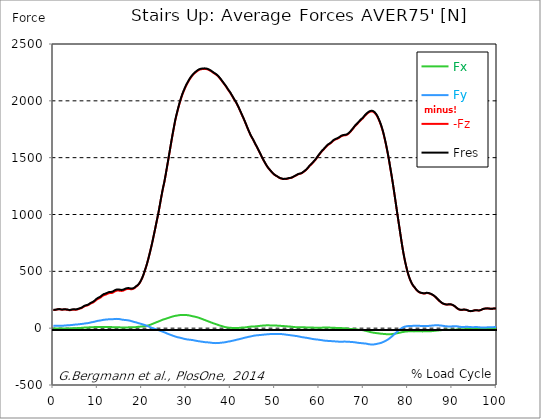
| Category |  Fx |  Fy |  -Fz |  Fres |
|---|---|---|---|---|
| 0.0 | -2.487 | 21.726 | 160.762 | 162.327 |
| 0.16678370786516855 | -2.748 | 21.4 | 160.659 | 162.187 |
| 0.3335674157303371 | -2.823 | 21.195 | 160.389 | 161.898 |
| 0.5003511235955057 | -2.804 | 21.064 | 160.1 | 161.591 |
| 0.6671348314606742 | -2.72 | 21.241 | 162.178 | 163.669 |
| 0.8339185393258427 | -2.767 | 21.083 | 164.06 | 165.532 |
| 1.0007022471910114 | -2.795 | 21.092 | 165.513 | 166.994 |
| 1.1674859550561796 | -2.73 | 21.4 | 166.352 | 167.861 |
| 1.3342696629213484 | -2.692 | 21.642 | 166.398 | 167.935 |
| 1.5010533707865168 | -2.814 | 21.707 | 165.448 | 166.994 |
| 1.6678370786516854 | -3.149 | 21.521 | 164.013 | 165.55 |
| 1.8346207865168538 | -3.522 | 21.213 | 162.504 | 164.023 |
| 2.001404494382023 | -3.577 | 21.204 | 162.327 | 163.855 |
| 2.1681882022471908 | -3.494 | 21.688 | 163.221 | 164.814 |
| 2.334971910112359 | -3.419 | 22.21 | 164.181 | 165.849 |
| 2.501755617977528 | -3.168 | 22.76 | 164.833 | 166.575 |
| 2.668539325842697 | -2.991 | 23.309 | 164.395 | 166.212 |
| 2.8353230337078656 | -2.711 | 23.999 | 163.79 | 165.709 |
| 3.0021067415730336 | -2.404 | 24.763 | 162.821 | 164.814 |
| 3.168890449438202 | -1.947 | 25.778 | 162.141 | 164.274 |
| 3.335674157303371 | -1.901 | 25.992 | 160.557 | 162.756 |
| 3.502457865168539 | -1.994 | 26.039 | 158.591 | 160.808 |
| 3.6692415730337076 | -2.012 | 26.235 | 157.315 | 159.579 |
| 3.8360252808988764 | -1.761 | 26.728 | 158.358 | 160.697 |
| 4.002808988764046 | -1.509 | 27.259 | 160.1 | 162.504 |
| 4.169592696629214 | -1.239 | 27.856 | 161.684 | 164.162 |
| 4.3363764044943816 | -0.941 | 28.657 | 162.849 | 165.439 |
| 4.50316011235955 | -0.643 | 29.467 | 163.408 | 166.128 |
| 4.669943820224718 | -0.419 | 30.529 | 163.035 | 165.96 |
| 4.836727528089888 | -0.205 | 31.219 | 162.374 | 165.457 |
| 5.003511235955056 | 0.009 | 31.703 | 161.88 | 165.075 |
| 5.170294943820225 | 0.224 | 32.244 | 162.448 | 165.727 |
| 5.337078651685394 | 0.438 | 32.477 | 163.473 | 166.78 |
| 5.5038623595505625 | 0.661 | 32.859 | 165.224 | 168.569 |
| 5.670646067415731 | 1.099 | 33.753 | 167.74 | 171.215 |
| 5.837429775280899 | 1.621 | 34.722 | 170.451 | 174.056 |
| 6.004213483146067 | 1.984 | 35.43 | 172.118 | 175.826 |
| 6.170997191011236 | 2.31 | 36.119 | 173.59 | 177.391 |
| 6.329002808988764 | 2.655 | 36.781 | 175.938 | 179.823 |
| 6.495786516853932 | 3.27 | 37.479 | 179.944 | 183.894 |
| 6.662570224719101 | 3.922 | 38.43 | 184.276 | 188.329 |
| 6.82935393258427 | 4.574 | 39.38 | 188.487 | 192.67 |
| 6.9961376404494375 | 5.198 | 40.544 | 192.288 | 196.639 |
| 7.162921348314607 | 5.655 | 41.672 | 195.064 | 199.601 |
| 7.329705056179775 | 5.897 | 42.557 | 196.788 | 201.483 |
| 7.496488764044945 | 6.046 | 43.162 | 198.064 | 202.853 |
| 7.663272471910113 | 6.195 | 43.787 | 199.518 | 204.418 |
| 7.830056179775281 | 6.521 | 44.774 | 202.229 | 207.287 |
| 7.996839887640449 | 6.931 | 46.041 | 205.881 | 211.154 |
| 8.16362359550562 | 7.323 | 47.504 | 210.25 | 215.747 |
| 8.330407303370787 | 8.003 | 49.33 | 215.16 | 220.945 |
| 8.497191011235955 | 8.422 | 50.867 | 218.709 | 224.755 |
| 8.663974719101123 | 8.534 | 52.05 | 221.243 | 227.504 |
| 8.830758426966291 | 8.618 | 53.149 | 223.628 | 230.075 |
| 8.99754213483146 | 8.841 | 54.351 | 226.721 | 233.373 |
| 9.16432584269663 | 9.251 | 55.637 | 230.941 | 237.789 |
| 9.331109550561798 | 9.782 | 57.426 | 236.494 | 243.621 |
| 9.497893258426966 | 10.332 | 59.41 | 242.512 | 249.947 |
| 9.664676966292134 | 10.77 | 61.217 | 248.167 | 255.881 |
| 9.831460674157304 | 11.012 | 62.801 | 252.9 | 260.865 |
| 9.998244382022472 | 11.217 | 64.208 | 256.785 | 264.974 |
| 10.16502808988764 | 11.226 | 65.139 | 259.673 | 268.002 |
| 10.331811797752808 | 11.077 | 65.978 | 262.607 | 271.048 |
| 10.498595505617978 | 10.975 | 66.91 | 265.924 | 274.495 |
| 10.665379213483147 | 10.853 | 68.139 | 270.321 | 279.051 |
| 10.832162921348315 | 10.872 | 69.509 | 275.455 | 284.352 |
| 10.998946629213483 | 10.993 | 70.906 | 280.988 | 290.072 |
| 11.165730337078653 | 11.142 | 72.276 | 286.112 | 295.373 |
| 11.33251404494382 | 11.263 | 73.422 | 289.625 | 299.062 |
| 11.49929775280899 | 11.226 | 74.391 | 292.28 | 301.876 |
| 11.666081460674157 | 10.844 | 74.931 | 293.444 | 303.115 |
| 11.832865168539326 | 10.462 | 75.35 | 294.982 | 304.698 |
| 11.999648876404493 | 10.276 | 75.89 | 298.363 | 308.099 |
| 12.166432584269662 | 10.229 | 76.487 | 301.661 | 311.443 |
| 12.333216292134832 | 10.36 | 77.353 | 304.549 | 314.453 |
| 12.5 | 10.509 | 78.201 | 307.214 | 317.238 |
| 12.66678370786517 | 10.593 | 78.816 | 308.509 | 318.645 |
| 12.833567415730336 | 10.378 | 79.049 | 308.984 | 319.148 |
| 13.000351123595506 | 9.847 | 78.825 | 308.686 | 318.785 |
| 13.167134831460674 | 9.232 | 78.518 | 308.593 | 318.589 |
| 13.333918539325843 | 8.832 | 78.788 | 310.838 | 320.816 |
| 13.500702247191011 | 8.45 | 79.244 | 314.154 | 324.132 |
| 13.667485955056181 | 8.142 | 79.869 | 318.794 | 328.772 |
| 13.834269662921349 | 8.003 | 80.642 | 323.014 | 333.048 |
| 14.001053370786519 | 7.816 | 81.136 | 326.275 | 336.327 |
| 14.167837078651687 | 7.695 | 81.499 | 328.856 | 338.908 |
| 14.334620786516853 | 7.751 | 81.75 | 330.56 | 340.622 |
| 14.501404494382026 | 7.854 | 81.648 | 331.352 | 341.367 |
| 14.668188202247192 | 7.77 | 81.163 | 331.213 | 341.116 |
| 14.834971910112362 | 7.528 | 80.334 | 330.467 | 340.193 |
| 15.001755617977528 | 7.201 | 79.235 | 329.061 | 338.563 |
| 15.168539325842698 | 6.829 | 77.866 | 327.924 | 337.147 |
| 15.335323033707864 | 6.41 | 76.468 | 327.682 | 336.597 |
| 15.502106741573034 | 6.009 | 75.192 | 328.008 | 336.635 |
| 15.6688904494382 | 5.664 | 74.074 | 328.911 | 337.268 |
| 15.83567415730337 | 5.646 | 73.235 | 331.79 | 339.914 |
| 16.00245786516854 | 5.59 | 72.574 | 335.097 | 343.026 |
| 16.16924157303371 | 5.636 | 71.912 | 338.321 | 346.053 |
| 16.336025280898877 | 5.907 | 71.437 | 341.293 | 348.876 |
| 16.502808988764045 | 6.242 | 70.739 | 343.603 | 351.019 |
| 16.669592696629216 | 6.54 | 69.975 | 344.935 | 352.193 |
| 16.83637640449438 | 6.987 | 69.136 | 345.616 | 352.705 |
| 17.003160112359552 | 7.267 | 68.028 | 345.644 | 352.528 |
| 17.169943820224717 | 7.416 | 66.649 | 344.945 | 351.587 |
| 17.336727528089888 | 7.201 | 65.009 | 343.473 | 349.808 |
| 17.503511235955056 | 6.959 | 63.146 | 342.373 | 348.355 |
| 17.670294943820224 | 7.052 | 61.245 | 342.541 | 348.168 |
| 17.837078651685395 | 7.211 | 59.28 | 343.538 | 348.802 |
| 18.003862359550563 | 7.444 | 57.323 | 345.951 | 350.87 |
| 18.17064606741573 | 7.714 | 55.441 | 349.361 | 353.944 |
| 18.3374297752809 | 7.984 | 53.662 | 353.702 | 357.96 |
| 18.504213483146067 | 8.534 | 52.031 | 359.143 | 363.121 |
| 18.662219101123597 | 9.465 | 50.764 | 365.142 | 368.86 |
| 18.829002808988765 | 10.434 | 48.64 | 369.745 | 373.155 |
| 18.995786516853933 | 11.357 | 46.47 | 374.776 | 377.915 |
| 19.1625702247191 | 12.139 | 44.569 | 381.306 | 384.204 |
| 19.32935393258427 | 12.633 | 42.743 | 389.607 | 392.272 |
| 19.49613764044944 | 13.071 | 40.833 | 398.951 | 401.364 |
| 19.662921348314608 | 13.76 | 39.026 | 410.261 | 412.46 |
| 19.829705056179776 | 14.468 | 37.144 | 423.257 | 425.26 |
| 19.996488764044944 | 15.232 | 35.327 | 437.269 | 439.104 |
| 20.163272471910112 | 15.922 | 33.492 | 452.883 | 454.542 |
| 20.33005617977528 | 16.527 | 31.377 | 470.407 | 471.898 |
| 20.49683988764045 | 17.291 | 29.235 | 489.384 | 490.707 |
| 20.663623595505616 | 18.232 | 27.045 | 509.275 | 510.486 |
| 20.830407303370787 | 19.229 | 24.753 | 529.286 | 530.395 |
| 20.997191011235955 | 20.375 | 22.322 | 549.773 | 550.779 |
| 21.163974719101123 | 21.949 | 19.816 | 572.663 | 573.613 |
| 21.330758426966295 | 23.598 | 17.235 | 596.354 | 597.248 |
| 21.497542134831463 | 25.406 | 14.552 | 621.163 | 622.011 |
| 21.66432584269663 | 27.53 | 11.822 | 647.603 | 648.46 |
| 21.8311095505618 | 29.849 | 9.046 | 674.108 | 674.993 |
| 21.997893258426966 | 32.188 | 6.27 | 700.762 | 701.693 |
| 22.164676966292134 | 34.563 | 3.54 | 728.31 | 729.288 |
| 22.331460674157306 | 37.153 | 0.932 | 757.405 | 758.467 |
| 22.498244382022467 | 39.855 | -1.407 | 787.953 | 789.099 |
| 22.66502808988764 | 42.492 | -3.605 | 818.976 | 820.234 |
| 22.831811797752806 | 45.156 | -5.627 | 849.273 | 850.633 |
| 22.99859550561798 | 47.923 | -7.779 | 880.696 | 882.178 |
| 23.165379213483146 | 50.653 | -10.062 | 912.689 | 914.272 |
| 23.332162921348313 | 53.233 | -12.158 | 944.019 | 945.724 |
| 23.49894662921348 | 55.6 | -14.459 | 975.573 | 977.381 |
| 23.665730337078653 | 57.947 | -16.816 | 1006.494 | 1008.413 |
| 23.83251404494382 | 60.621 | -19.042 | 1041.449 | 1043.499 |
| 23.999297752808985 | 63.192 | -21.213 | 1077.484 | 1079.646 |
| 24.166081460674157 | 66.229 | -23.71 | 1114.256 | 1116.575 |
| 24.332865168539325 | 69.015 | -26.114 | 1149.583 | 1152.043 |
| 24.499648876404496 | 71.801 | -28.573 | 1184.501 | 1187.1 |
| 24.666432584269664 | 74.53 | -30.995 | 1218.71 | 1221.468 |
| 24.833216292134832 | 76.626 | -33.296 | 1249.109 | 1251.978 |
| 25.0 | 78.499 | -35.56 | 1277.794 | 1280.784 |
| 25.16678370786517 | 80.605 | -38.392 | 1312.05 | 1315.171 |
| 25.33356741573034 | 82.71 | -41.308 | 1347.806 | 1351.057 |
| 25.500351123595504 | 84.937 | -44.318 | 1385.192 | 1388.583 |
| 25.66713483146067 | 87.079 | -47.103 | 1422.466 | 1425.988 |
| 25.833918539325843 | 89.166 | -49.674 | 1459.955 | 1463.598 |
| 26.00070224719101 | 91.262 | -52.199 | 1497.817 | 1501.59 |
| 26.16748595505618 | 93.405 | -54.733 | 1535.92 | 1539.814 |
| 26.334269662921347 | 95.576 | -57.193 | 1574.08 | 1578.104 |
| 26.50105337078652 | 97.812 | -59.727 | 1613.264 | 1617.41 |
| 26.667837078651687 | 99.954 | -62.028 | 1651.274 | 1655.541 |
| 26.834620786516858 | 101.957 | -64.338 | 1688.344 | 1692.723 |
| 27.001404494382022 | 103.811 | -66.723 | 1723.82 | 1728.301 |
| 27.16818820224719 | 105.591 | -69.09 | 1758.868 | 1763.461 |
| 27.334971910112362 | 107.091 | -71.419 | 1793.786 | 1798.462 |
| 27.50175561797753 | 108.32 | -73.617 | 1827.026 | 1831.777 |
| 27.668539325842698 | 109.466 | -75.76 | 1855.543 | 1860.378 |
| 27.835323033707866 | 110.379 | -77.819 | 1882.821 | 1887.722 |
| 28.002106741573037 | 111.563 | -79.514 | 1908.954 | 1913.919 |
| 28.168890449438205 | 112.671 | -80.726 | 1933.828 | 1938.849 |
| 28.335674157303373 | 113.789 | -81.927 | 1958.218 | 1963.286 |
| 28.502457865168537 | 114.926 | -83.381 | 1981.76 | 1986.903 |
| 28.669241573033705 | 115.755 | -84.974 | 2003.737 | 2008.936 |
| 28.836025280898877 | 116.146 | -86.604 | 2023.963 | 2029.199 |
| 29.002808988764052 | 116.388 | -88.235 | 2043.415 | 2048.698 |
| 29.169592696629213 | 116.714 | -90.07 | 2061.713 | 2067.042 |
| 29.336376404494384 | 116.817 | -91.84 | 2078.23 | 2083.597 |
| 29.50316011235955 | 116.556 | -93.358 | 2093.304 | 2098.689 |
| 29.669943820224724 | 116.398 | -95.091 | 2109.03 | 2114.443 |
| 29.836727528089884 | 116.221 | -96.722 | 2123.917 | 2129.358 |
| 30.003511235955056 | 115.68 | -97.886 | 2137.342 | 2142.783 |
| 30.170294943820224 | 114.73 | -98.864 | 2149.491 | 2154.894 |
| 30.337078651685395 | 113.873 | -99.861 | 2161.425 | 2166.81 |
| 30.503862359550563 | 113.118 | -100.532 | 2172.986 | 2178.334 |
| 30.670646067415728 | 111.879 | -101.203 | 2184.203 | 2189.504 |
| 30.837429775280903 | 110.323 | -101.836 | 2194.377 | 2199.603 |
| 30.99543539325843 | 108.786 | -102.591 | 2203.879 | 2209.04 |
| 31.162219101123597 | 107.268 | -103.392 | 2212.86 | 2217.975 |
| 31.32900280898876 | 105.74 | -104.203 | 2221.422 | 2226.48 |
| 31.495786516853936 | 104.324 | -105.218 | 2229.331 | 2234.362 |
| 31.6625702247191 | 102.982 | -106.467 | 2236.309 | 2241.321 |
| 31.82935393258427 | 101.743 | -107.938 | 2242.337 | 2247.358 |
| 31.996137640449433 | 100.467 | -109.373 | 2247.889 | 2252.929 |
| 32.162921348314605 | 98.846 | -110.789 | 2253.013 | 2258.044 |
| 32.329705056179776 | 97.094 | -111.991 | 2258.025 | 2263.038 |
| 32.49648876404494 | 95.324 | -113.156 | 2263.047 | 2268.031 |
| 32.66327247191011 | 93.284 | -114.199 | 2267.826 | 2272.764 |
| 32.83005617977528 | 90.824 | -115.01 | 2271.487 | 2276.369 |
| 32.996839887640455 | 88.672 | -116.053 | 2274.45 | 2279.294 |
| 33.16362359550562 | 86.567 | -117.273 | 2276.453 | 2281.279 |
| 33.330407303370784 | 84.201 | -118.047 | 2277.869 | 2282.648 |
| 33.497191011235955 | 81.722 | -118.624 | 2279.09 | 2283.804 |
| 33.66397471910113 | 79.17 | -119.789 | 2279.853 | 2284.549 |
| 33.83075842696629 | 76.599 | -120.963 | 2280.515 | 2285.21 |
| 33.997542134831455 | 74.055 | -121.987 | 2280.934 | 2285.592 |
| 34.164325842696634 | 71.549 | -123.059 | 2281.12 | 2285.76 |
| 34.3311095505618 | 69.08 | -123.683 | 2280.925 | 2285.518 |
| 34.49789325842697 | 66.593 | -124.028 | 2279.863 | 2284.409 |
| 34.66467696629213 | 64.217 | -124.745 | 2277.962 | 2282.481 |
| 34.831460674157306 | 61.711 | -125.006 | 2275.913 | 2280.357 |
| 34.99824438202247 | 59.028 | -125.146 | 2273.285 | 2277.673 |
| 35.16502808988764 | 56.69 | -125.742 | 2270.267 | 2274.636 |
| 35.331811797752806 | 54.184 | -126.701 | 2266.764 | 2271.133 |
| 35.49859550561798 | 51.882 | -127.605 | 2262.73 | 2267.099 |
| 35.66537921348315 | 49.078 | -128.472 | 2258.473 | 2262.842 |
| 35.83216292134831 | 46.386 | -129.217 | 2253.973 | 2258.333 |
| 35.998946629213485 | 44.103 | -130.232 | 2248.774 | 2253.181 |
| 36.16573033707865 | 41.923 | -130.838 | 2243.958 | 2248.364 |
| 36.33251404494382 | 39.706 | -131.211 | 2240.138 | 2244.535 |
| 36.499297752808985 | 37.554 | -131.481 | 2236.477 | 2240.856 |
| 36.666081460674164 | 35.495 | -131.639 | 2232.294 | 2236.654 |
| 36.83286516853932 | 33.343 | -131.388 | 2227.012 | 2231.344 |
| 36.99964887640449 | 30.734 | -130.81 | 2221.357 | 2225.623 |
| 37.166432584269664 | 28.564 | -130.409 | 2215.301 | 2219.531 |
| 37.333216292134836 | 26.356 | -129.888 | 2208.267 | 2212.45 |
| 37.5 | 24.204 | -129.562 | 2200.544 | 2204.699 |
| 37.666783707865164 | 21.884 | -129.068 | 2192.597 | 2196.706 |
| 37.833567415730336 | 19.928 | -128.173 | 2184.185 | 2188.237 |
| 38.00035112359551 | 18.176 | -127.382 | 2175.511 | 2179.517 |
| 38.16713483146068 | 16.359 | -126.711 | 2166.437 | 2170.396 |
| 38.333918539325836 | 14.44 | -126.096 | 2157.652 | 2161.574 |
| 38.50070224719101 | 12.297 | -125.528 | 2148.932 | 2152.817 |
| 38.66748595505618 | 10.397 | -124.494 | 2140.407 | 2144.246 |
| 38.83426966292135 | 8.571 | -123.189 | 2132.265 | 2136.038 |
| 39.001053370786515 | 7.36 | -121.736 | 2122.613 | 2126.312 |
| 39.16783707865169 | 6.158 | -120.031 | 2112.626 | 2116.241 |
| 39.33462078651686 | 5.674 | -118.773 | 2101.968 | 2105.527 |
| 39.50140449438202 | 4.817 | -117.814 | 2092.568 | 2096.09 |
| 39.668188202247194 | 3.987 | -117.05 | 2083.979 | 2087.472 |
| 39.83497191011236 | 3.326 | -116.044 | 2074.727 | 2078.184 |
| 40.00175561797753 | 2.953 | -114.628 | 2064.358 | 2067.759 |
| 40.168539325842694 | 2.692 | -113.323 | 2053.347 | 2056.691 |
| 40.335323033707866 | 2.227 | -111.451 | 2042.54 | 2045.81 |
| 40.50210674157304 | 1.714 | -109.839 | 2031.276 | 2034.472 |
| 40.6688904494382 | 1.258 | -108.47 | 2020.153 | 2023.292 |
| 40.83567415730337 | 0.997 | -107.128 | 2008.955 | 2012.029 |
| 41.00245786516854 | 0.885 | -105.554 | 1998.53 | 2001.539 |
| 41.16924157303371 | 0.904 | -103.849 | 1988.729 | 1991.663 |
| 41.33602528089887 | 1.053 | -101.967 | 1976.664 | 1979.506 |
| 41.502808988764045 | 1.314 | -100.355 | 1963.677 | 1966.454 |
| 41.669592696629216 | 1.519 | -99.041 | 1950.551 | 1953.28 |
| 41.83637640449439 | 1.919 | -97.653 | 1937.284 | 1939.958 |
| 42.00316011235955 | 2.814 | -96.125 | 1923.021 | 1925.648 |
| 42.16994382022472 | 3.792 | -94.57 | 1908.627 | 1911.189 |
| 42.33672752808989 | 4.64 | -92.911 | 1894.001 | 1896.498 |
| 42.50351123595506 | 5.152 | -91.151 | 1879.44 | 1881.862 |
| 42.670294943820224 | 5.441 | -89.306 | 1865.027 | 1867.375 |
| 42.83707865168539 | 5.674 | -87.536 | 1850.736 | 1853.019 |
| 43.00386235955057 | 5.981 | -85.952 | 1835.746 | 1837.973 |
| 43.17064606741573 | 6.316 | -84.303 | 1820.505 | 1822.666 |
| 43.32865168539326 | 6.95 | -82.738 | 1804.984 | 1807.089 |
| 43.495435393258425 | 7.807 | -81.219 | 1789.239 | 1791.298 |
| 43.6622191011236 | 8.981 | -79.729 | 1772.666 | 1774.669 |
| 43.82900280898876 | 10.183 | -78.257 | 1756.837 | 1758.803 |
| 43.99578651685393 | 11.152 | -76.729 | 1741.484 | 1743.394 |
| 44.162570224719104 | 11.925 | -75.201 | 1726.364 | 1728.236 |
| 44.32935393258427 | 12.801 | -73.86 | 1711.532 | 1713.367 |
| 44.49613764044944 | 13.891 | -72.574 | 1697.586 | 1699.393 |
| 44.66292134831461 | 14.636 | -71.335 | 1685.055 | 1686.835 |
| 44.82970505617978 | 14.897 | -69.909 | 1673.894 | 1675.636 |
| 44.99648876404493 | 14.906 | -68.307 | 1662.296 | 1663.982 |
| 45.16327247191011 | 15.102 | -66.863 | 1649.374 | 1651.014 |
| 45.33005617977528 | 15.269 | -65.661 | 1636.499 | 1638.101 |
| 45.49683988764045 | 15.465 | -64.608 | 1623.912 | 1625.487 |
| 45.66362359550561 | 15.968 | -63.77 | 1611.755 | 1613.32 |
| 45.83040730337079 | 16.788 | -63.155 | 1599.867 | 1601.432 |
| 45.99719101123596 | 17.626 | -62.596 | 1587.29 | 1588.855 |
| 46.16397471910113 | 18.446 | -62.074 | 1574.21 | 1575.785 |
| 46.33075842696629 | 19.08 | -61.366 | 1561.139 | 1562.704 |
| 46.497542134831455 | 19.732 | -60.789 | 1548.152 | 1549.699 |
| 46.66432584269663 | 20.421 | -60.127 | 1534.988 | 1536.535 |
| 46.83110955056179 | 21.139 | -59.54 | 1521.862 | 1523.399 |
| 46.99789325842696 | 21.903 | -58.823 | 1508.167 | 1509.695 |
| 47.164676966292134 | 22.424 | -58.078 | 1495.18 | 1496.689 |
| 47.331460674157306 | 22.871 | -57.239 | 1482.864 | 1484.354 |
| 47.49824438202247 | 23.309 | -56.773 | 1471.004 | 1472.476 |
| 47.66502808988764 | 23.85 | -56.364 | 1459.48 | 1460.952 |
| 47.83181179775281 | 24.306 | -55.683 | 1448.086 | 1449.549 |
| 47.99859550561797 | 24.688 | -54.929 | 1436.692 | 1438.136 |
| 48.16537921348314 | 24.93 | -54.305 | 1426.184 | 1427.609 |
| 48.33216292134831 | 24.93 | -53.69 | 1416.672 | 1418.078 |
| 48.498946629213485 | 24.772 | -53.103 | 1407.84 | 1409.228 |
| 48.66573033707865 | 24.604 | -52.702 | 1400.023 | 1401.393 |
| 48.83251404494382 | 24.511 | -52.339 | 1392.356 | 1393.716 |
| 48.99929775280899 | 24.353 | -51.808 | 1384.419 | 1385.76 |
| 49.166081460674164 | 24.269 | -51.594 | 1377.208 | 1378.54 |
| 49.33286516853933 | 24.418 | -51.491 | 1369.885 | 1371.218 |
| 49.499648876404486 | 24.446 | -51.445 | 1363.047 | 1364.389 |
| 49.666432584269664 | 24.39 | -51.379 | 1357.029 | 1358.37 |
| 49.83321629213483 | 24.334 | -51.258 | 1351.169 | 1352.501 |
| 50.0 | 24.045 | -51.091 | 1345.933 | 1347.265 |
| 50.166783707865164 | 23.347 | -50.839 | 1342.095 | 1343.39 |
| 50.33356741573034 | 22.639 | -50.699 | 1338.508 | 1339.775 |
| 50.50035112359551 | 22.257 | -50.886 | 1334.744 | 1336.002 |
| 50.66713483146068 | 22.08 | -51.109 | 1330.133 | 1331.409 |
| 50.83391853932584 | 21.837 | -51.398 | 1326.089 | 1327.375 |
| 51.00070224719101 | 21.502 | -51.435 | 1321.869 | 1323.155 |
| 51.16748595505618 | 20.729 | -51.435 | 1319.223 | 1320.5 |
| 51.33426966292134 | 20.086 | -51.761 | 1317.584 | 1318.86 |
| 51.50105337078652 | 19.62 | -52.134 | 1315.609 | 1316.894 |
| 51.66783707865169 | 19.331 | -52.721 | 1313.578 | 1314.891 |
| 51.83462078651686 | 18.996 | -53.336 | 1311.78 | 1313.112 |
| 52.00140449438202 | 18.353 | -54.118 | 1311.733 | 1313.093 |
| 52.168188202247194 | 17.664 | -55.05 | 1312.301 | 1313.689 |
| 52.33497191011236 | 17.366 | -56.131 | 1312.599 | 1314.043 |
| 52.50175561797752 | 17.095 | -57.221 | 1312.888 | 1314.379 |
| 52.668539325842694 | 16.35 | -58.096 | 1313.745 | 1315.264 |
| 52.835323033707866 | 15.213 | -58.748 | 1315.208 | 1316.745 |
| 53.00210674157304 | 14.682 | -59.54 | 1317.192 | 1318.757 |
| 53.1688904494382 | 14.235 | -60.351 | 1319.195 | 1320.788 |
| 53.33567415730337 | 14.096 | -61.199 | 1320.434 | 1322.074 |
| 53.502457865168545 | 13.742 | -62.168 | 1320.807 | 1322.493 |
| 53.669241573033716 | 13.145 | -63.127 | 1321.692 | 1323.416 |
| 53.83602528089887 | 11.934 | -63.826 | 1324.58 | 1326.332 |
| 54.002808988764045 | 11.114 | -64.636 | 1328.092 | 1329.881 |
| 54.169592696629216 | 10.499 | -65.559 | 1331.633 | 1333.468 |
| 54.33637640449438 | 10.164 | -66.63 | 1335.294 | 1337.185 |
| 54.50316011235955 | 9.493 | -67.636 | 1338.433 | 1340.371 |
| 54.669943820224724 | 8.683 | -68.521 | 1341.275 | 1343.25 |
| 54.836727528089895 | 8.114 | -69.313 | 1344.657 | 1346.669 |
| 55.00351123595506 | 7.649 | -70.114 | 1348.83 | 1350.871 |
| 55.17029494382022 | 8.012 | -71.325 | 1353.041 | 1355.147 |
| 55.337078651685395 | 8.319 | -72.658 | 1355.603 | 1357.783 |
| 55.50386235955056 | 8.562 | -74.074 | 1356.898 | 1359.153 |
| 55.66186797752809 | 8.552 | -75.583 | 1358.268 | 1360.606 |
| 55.82865168539326 | 8.506 | -77.26 | 1359.777 | 1362.209 |
| 55.995435393258425 | 8.31 | -78.611 | 1362.404 | 1364.901 |
| 56.1622191011236 | 7.993 | -79.589 | 1366.606 | 1369.149 |
| 56.32900280898877 | 7.677 | -80.306 | 1371.283 | 1373.854 |
| 56.49578651685393 | 7.593 | -81.182 | 1376.155 | 1378.773 |
| 56.6625702247191 | 7.677 | -82.309 | 1380.962 | 1383.636 |
| 56.82935393258427 | 7.285 | -83.427 | 1385.956 | 1388.686 |
| 56.99613764044943 | 6.568 | -84.424 | 1391.359 | 1394.136 |
| 57.16292134831461 | 5.907 | -85.225 | 1397.694 | 1400.508 |
| 57.329705056179776 | 5.487 | -86.222 | 1404.551 | 1407.421 |
| 57.49648876404495 | 5.348 | -87.405 | 1412.554 | 1415.488 |
| 57.66327247191011 | 5.422 | -88.803 | 1420.808 | 1423.827 |
| 57.83005617977529 | 5.198 | -90.07 | 1428.131 | 1431.214 |
| 57.99683988764044 | 5.31 | -91.197 | 1434.419 | 1437.559 |
| 58.16362359550561 | 5.478 | -92.557 | 1440.391 | 1443.596 |
| 58.33040730337079 | 5.655 | -93.917 | 1446.353 | 1449.642 |
| 58.497191011235955 | 5.292 | -95.119 | 1453.676 | 1457.03 |
| 58.66397471910112 | 4.91 | -96.163 | 1460.458 | 1463.868 |
| 58.83075842696629 | 4.621 | -97.066 | 1468.209 | 1471.666 |
| 58.99754213483147 | 4.267 | -97.989 | 1475.523 | 1479.026 |
| 59.164325842696634 | 3.913 | -98.864 | 1483.115 | 1486.656 |
| 59.33110955056179 | 3.801 | -99.377 | 1492.162 | 1495.711 |
| 59.49789325842697 | 3.689 | -100.113 | 1500.993 | 1504.561 |
| 59.664676966292134 | 3.708 | -100.672 | 1510.664 | 1514.241 |
| 59.8314606741573 | 3.605 | -101.538 | 1519.253 | 1522.849 |
| 59.99824438202247 | 3.661 | -102.61 | 1527.675 | 1531.318 |
| 60.16502808988765 | 3.801 | -103.616 | 1536.041 | 1539.721 |
| 60.33181179775281 | 4.062 | -104.408 | 1544.435 | 1548.143 |
| 60.49859550561798 | 4.36 | -105.274 | 1552.652 | 1556.388 |
| 60.66537921348315 | 4.695 | -106.234 | 1560.347 | 1564.121 |
| 60.83216292134831 | 5.226 | -107.557 | 1566.673 | 1570.502 |
| 60.99894662921348 | 5.413 | -108.814 | 1573.008 | 1576.902 |
| 61.16573033707864 | 5.534 | -109.643 | 1579.856 | 1583.769 |
| 61.33251404494383 | 5.655 | -110.193 | 1587.02 | 1590.951 |
| 61.49929775280899 | 5.702 | -110.65 | 1594.37 | 1598.311 |
| 61.66608146067416 | 5.748 | -111.087 | 1601.647 | 1605.597 |
| 61.83286516853932 | 5.73 | -111.6 | 1608.326 | 1612.295 |
| 61.99964887640451 | 5.627 | -112.271 | 1613.106 | 1617.102 |
| 62.16643258426967 | 5.459 | -112.979 | 1617.018 | 1621.043 |
| 62.33321629213482 | 5.059 | -113.351 | 1621.295 | 1625.329 |
| 62.5 | 4.695 | -113.621 | 1625.869 | 1629.903 |
| 62.66678370786517 | 4.351 | -113.854 | 1630.769 | 1634.812 |
| 62.833567415730336 | 3.95 | -114.171 | 1636.75 | 1640.794 |
| 63.0003511235955 | 3.466 | -114.562 | 1643.71 | 1647.762 |
| 63.16713483146068 | 3.102 | -115.131 | 1650.464 | 1654.544 |
| 63.33391853932585 | 2.851 | -115.783 | 1654.377 | 1658.485 |
| 63.500702247191015 | 2.599 | -116.277 | 1658.224 | 1662.351 |
| 63.66748595505618 | 2.534 | -116.537 | 1660.628 | 1664.774 |
| 63.83426966292135 | 2.497 | -116.854 | 1663.19 | 1667.354 |
| 64.00105337078651 | 2.282 | -117.348 | 1665.556 | 1669.739 |
| 64.16783707865169 | 1.938 | -117.963 | 1668.128 | 1672.348 |
| 64.33462078651687 | 1.574 | -118.559 | 1671.686 | 1675.935 |
| 64.50140449438203 | 1.314 | -118.997 | 1676.084 | 1680.36 |
| 64.6681882022472 | 1.062 | -119.276 | 1680.854 | 1685.13 |
| 64.83497191011236 | 0.866 | -119.453 | 1685.521 | 1689.807 |
| 65.00175561797754 | 0.634 | -119.528 | 1689.499 | 1693.775 |
| 65.16853932584269 | -0.168 | -119.193 | 1692.052 | 1696.3 |
| 65.33532303370787 | -0.932 | -118.699 | 1694.017 | 1698.228 |
| 65.50210674157304 | -1.565 | -118.14 | 1695.816 | 1699.98 |
| 65.66889044943821 | -1.127 | -118.047 | 1696.43 | 1700.576 |
| 65.83567415730337 | -0.503 | -118.252 | 1696.663 | 1700.828 |
| 66.00245786516854 | -1.36 | -118.55 | 1698.005 | 1702.188 |
| 66.1692415730337 | -2.422 | -118.801 | 1700.045 | 1704.247 |
| 66.33602528089888 | -3.82 | -118.978 | 1703.669 | 1707.88 |
| 66.50280898876404 | -4.975 | -119.379 | 1708.56 | 1712.79 |
| 66.66959269662921 | -6.167 | -120.124 | 1713.47 | 1717.746 |
| 66.83637640449439 | -6.531 | -120.338 | 1719.879 | 1724.146 |
| 67.00316011235955 | -6.708 | -120.786 | 1726.969 | 1731.264 |
| 67.16994382022472 | -6.941 | -120.925 | 1734.534 | 1738.81 |
| 67.33672752808988 | -7.229 | -120.981 | 1742.211 | 1746.477 |
| 67.50351123595506 | -7.863 | -121.708 | 1750.12 | 1754.424 |
| 67.67029494382022 | -8.757 | -122.872 | 1757.927 | 1762.297 |
| 67.83707865168539 | -9.493 | -123.329 | 1767.057 | 1771.454 |
| 67.99508426966291 | -9.717 | -124.102 | 1775.237 | 1779.671 |
| 68.16186797752809 | -9.968 | -125.108 | 1782.466 | 1786.957 |
| 68.32865168539327 | -10.676 | -126.413 | 1788.252 | 1792.817 |
| 68.49543539325843 | -11.422 | -127.577 | 1794.428 | 1799.068 |
| 68.6622191011236 | -12.381 | -128.22 | 1802.096 | 1806.772 |
| 68.82900280898876 | -13.807 | -129.254 | 1808.953 | 1813.704 |
| 68.99578651685394 | -14.412 | -130.074 | 1815.791 | 1820.589 |
| 69.1625702247191 | -14.692 | -130.493 | 1822.759 | 1827.585 |
| 69.32935393258425 | -15.54 | -131.024 | 1829.262 | 1834.116 |
| 69.49613764044945 | -16.061 | -131.853 | 1835.597 | 1840.507 |
| 69.66292134831461 | -16.518 | -132.589 | 1840.805 | 1845.761 |
| 69.82970505617978 | -17.179 | -133.335 | 1846.711 | 1851.705 |
| 69.99648876404494 | -18.996 | -133.875 | 1854.835 | 1859.857 |
| 70.16327247191012 | -21.139 | -134.313 | 1863.35 | 1868.39 |
| 70.33005617977528 | -22.694 | -134.769 | 1870.617 | 1875.685 |
| 70.49683988764045 | -23.859 | -135.31 | 1876.989 | 1882.085 |
| 70.66362359550561 | -25.117 | -136.567 | 1882.942 | 1888.113 |
| 70.83040730337079 | -26.812 | -138.272 | 1889.194 | 1894.476 |
| 70.99719101123596 | -28.536 | -139.847 | 1894.551 | 1899.945 |
| 71.16397471910112 | -30.315 | -141.272 | 1898.966 | 1904.472 |
| 71.3307584269663 | -32.178 | -142.213 | 1902.469 | 1908.068 |
| 71.49754213483146 | -34.144 | -142.679 | 1905.087 | 1910.742 |
| 71.66432584269663 | -35.961 | -143.061 | 1907.202 | 1912.913 |
| 71.83110955056179 | -37.219 | -143.145 | 1907.286 | 1913.025 |
| 71.99789325842697 | -38.281 | -143.35 | 1905.935 | 1911.711 |
| 72.16467696629215 | -39.417 | -143.424 | 1903.438 | 1909.252 |
| 72.3314606741573 | -40.395 | -142.819 | 1899.33 | 1905.125 |
| 72.49824438202248 | -41.411 | -141.878 | 1893.693 | 1899.46 |
| 72.66502808988764 | -42.398 | -140.862 | 1886.697 | 1892.436 |
| 72.8318117977528 | -43.311 | -139.614 | 1877.567 | 1883.259 |
| 72.99859550561797 | -44.169 | -138.17 | 1867.077 | 1872.713 |
| 73.16537921348315 | -44.858 | -136.512 | 1854.956 | 1860.527 |
| 73.33216292134833 | -45.575 | -134.937 | 1841.122 | 1846.637 |
| 73.49894662921349 | -46.498 | -133.67 | 1825.703 | 1831.19 |
| 73.66573033707864 | -47.457 | -132.338 | 1809.754 | 1815.222 |
| 73.83251404494382 | -48.445 | -130.67 | 1792.705 | 1798.127 |
| 73.99929775280899 | -49.199 | -128.406 | 1773.532 | 1778.87 |
| 74.16608146067415 | -49.74 | -125.77 | 1752.943 | 1758.169 |
| 74.33286516853933 | -50.187 | -122.938 | 1730.64 | 1735.745 |
| 74.49964887640449 | -50.504 | -119.919 | 1705.737 | 1710.712 |
| 74.66643258426967 | -51.053 | -116.882 | 1678.618 | 1683.481 |
| 74.83321629213484 | -51.64 | -113.77 | 1650.482 | 1655.224 |
| 75.0 | -52.33 | -110.407 | 1620.885 | 1625.515 |
| 75.16678370786516 | -52.963 | -106.886 | 1589.861 | 1594.361 |
| 75.33356741573033 | -53.625 | -103.15 | 1557.143 | 1561.512 |
| 75.5003511235955 | -54.146 | -99.228 | 1523.315 | 1527.545 |
| 75.66713483146067 | -54.295 | -94.793 | 1487.597 | 1491.64 |
| 75.83391853932585 | -53.979 | -89.716 | 1449.493 | 1453.313 |
| 76.00070224719101 | -53.503 | -84.424 | 1410.756 | 1414.343 |
| 76.16748595505618 | -52.935 | -79.3 | 1371.916 | 1375.289 |
| 76.33426966292136 | -52.339 | -74.223 | 1333.291 | 1336.43 |
| 76.50105337078652 | -51.519 | -68.717 | 1293.138 | 1296.044 |
| 76.66783707865167 | -50.606 | -62.932 | 1251.354 | 1254.009 |
| 76.83462078651685 | -49.656 | -57.016 | 1208.117 | 1210.549 |
| 77.00140449438202 | -48.51 | -50.858 | 1164.033 | 1166.231 |
| 77.1681882022472 | -47.383 | -44.783 | 1120.731 | 1122.678 |
| 77.33497191011236 | -46.172 | -38.97 | 1076.45 | 1078.22 |
| 77.50175561797754 | -44.914 | -33.138 | 1031.76 | 1033.353 |
| 77.6685393258427 | -43.647 | -27.399 | 987.778 | 989.194 |
| 77.83532303370787 | -42.408 | -21.875 | 944.802 | 946.087 |
| 78.00210674157303 | -41.066 | -16.611 | 901.863 | 903.046 |
| 78.1688904494382 | -39.65 | -11.487 | 858.952 | 860.042 |
| 78.33567415730337 | -38.215 | -6.326 | 815.25 | 816.256 |
| 78.50245786516854 | -36.622 | -1.658 | 772.348 | 773.317 |
| 78.66924157303372 | -35.085 | 2.571 | 730.974 | 731.925 |
| 78.83602528089888 | -33.809 | 6.261 | 691.734 | 692.675 |
| 79.00280898876404 | -32.709 | 9.437 | 654.45 | 655.401 |
| 79.16959269662921 | -31.685 | 11.841 | 620.427 | 621.415 |
| 79.33637640449439 | -30.734 | 13.881 | 588.445 | 589.479 |
| 79.50316011235955 | -29.905 | 15.521 | 559.089 | 560.17 |
| 79.66994382022472 | -29.169 | 16.583 | 531.55 | 532.677 |
| 79.8367275280899 | -28.489 | 17.561 | 505.036 | 506.21 |
| 80.00351123595506 | -28.014 | 18.465 | 480.981 | 482.23 |
| 80.17029494382022 | -27.781 | 19.285 | 459.926 | 461.249 |
| 80.32830056179776 | -27.679 | 19.76 | 441.163 | 442.561 |
| 80.49508426966293 | -27.679 | 19.965 | 423.993 | 425.447 |
| 80.66186797752809 | -27.763 | 20.058 | 409.069 | 410.578 |
| 80.82865168539325 | -27.763 | 20.17 | 395.411 | 396.967 |
| 80.99543539325842 | -27.828 | 20.142 | 383.384 | 384.977 |
| 81.1622191011236 | -28.014 | 20.142 | 373.201 | 374.85 |
| 81.32900280898878 | -28.322 | 20.542 | 365.385 | 367.108 |
| 81.49578651685394 | -28.359 | 21.288 | 357.568 | 359.376 |
| 81.6625702247191 | -28.014 | 21.558 | 348.737 | 350.6 |
| 81.82935393258427 | -27.828 | 21.362 | 339.83 | 341.721 |
| 81.99613764044945 | -27.884 | 20.962 | 331.902 | 333.812 |
| 82.16292134831461 | -27.846 | 20.533 | 325.874 | 327.784 |
| 82.32970505617978 | -27.697 | 20.244 | 320.918 | 322.809 |
| 82.49648876404494 | -27.66 | 20.384 | 316.931 | 318.841 |
| 82.66327247191012 | -27.763 | 20.244 | 313.586 | 315.505 |
| 82.83005617977528 | -27.93 | 19.928 | 310.763 | 312.692 |
| 82.99683988764045 | -28.144 | 19.294 | 308.667 | 310.586 |
| 83.16362359550563 | -28.322 | 19.164 | 308.006 | 309.934 |
| 83.33040730337079 | -28.349 | 19.49 | 307.642 | 309.599 |
| 83.49719101123596 | -27.912 | 19.397 | 305.043 | 306.953 |
| 83.66397471910112 | -27.921 | 19.229 | 304.503 | 306.413 |
| 83.8307584269663 | -27.79 | 19.089 | 304.969 | 306.851 |
| 83.99754213483146 | -27.818 | 19.201 | 307.316 | 309.208 |
| 84.16432584269663 | -27.818 | 19.434 | 309.273 | 311.155 |
| 84.33110955056179 | -27.558 | 19.797 | 308.928 | 310.819 |
| 84.49789325842697 | -27.399 | 19.946 | 308.285 | 310.176 |
| 84.66467696629213 | -27.343 | 20.011 | 307.447 | 309.347 |
| 84.8314606741573 | -27.166 | 20.459 | 305.518 | 307.447 |
| 84.99824438202248 | -26.933 | 21.073 | 302.863 | 304.829 |
| 85.16502808988764 | -26.523 | 21.623 | 300.078 | 302.062 |
| 85.3318117977528 | -26.048 | 22.396 | 296.826 | 298.857 |
| 85.49859550561797 | -25.489 | 23.272 | 293.156 | 295.233 |
| 85.66537921348315 | -24.856 | 23.747 | 289.448 | 291.535 |
| 85.83216292134831 | -24.204 | 24.25 | 285.423 | 287.519 |
| 85.99894662921348 | -23.533 | 24.809 | 280.569 | 282.693 |
| 86.16573033707866 | -22.788 | 25.089 | 274.979 | 277.113 |
| 86.33251404494384 | -22.005 | 25.303 | 268.831 | 270.983 |
| 86.499297752809 | -21.204 | 25.471 | 261.592 | 263.772 |
| 86.66608146067415 | -20.459 | 25.452 | 254.297 | 256.496 |
| 86.83286516853933 | -19.816 | 25.014 | 248.54 | 250.673 |
| 86.99964887640449 | -19.21 | 24.679 | 242.587 | 244.692 |
| 87.16643258426966 | -18.661 | 24.157 | 236.056 | 238.124 |
| 87.33321629213482 | -18.092 | 23.43 | 230.429 | 232.423 |
| 87.5 | -17.403 | 22.732 | 225.519 | 227.42 |
| 87.66678370786518 | -16.658 | 21.977 | 220.889 | 222.687 |
| 87.83356741573033 | -16.043 | 20.962 | 217.004 | 218.69 |
| 88.00035112359551 | -15.586 | 20.011 | 213.855 | 215.43 |
| 88.16713483146067 | -15.241 | 18.865 | 211.48 | 212.933 |
| 88.33391853932584 | -14.915 | 18.102 | 209.346 | 210.706 |
| 88.500702247191 | -14.72 | 17.095 | 208.182 | 209.449 |
| 88.66748595505618 | -14.627 | 16.35 | 207.716 | 208.918 |
| 88.83426966292136 | -14.599 | 15.931 | 207.511 | 208.675 |
| 89.00105337078652 | -14.431 | 15.521 | 207.818 | 208.936 |
| 89.16783707865169 | -14.422 | 15.213 | 208.489 | 209.588 |
| 89.33462078651687 | -14.459 | 14.906 | 209.234 | 210.306 |
| 89.50140449438203 | -14.617 | 14.934 | 209.207 | 210.287 |
| 89.6681882022472 | -14.72 | 15.167 | 208.61 | 209.719 |
| 89.83497191011236 | -14.738 | 15.549 | 207.176 | 208.312 |
| 90.00175561797754 | -14.468 | 15.977 | 204.39 | 205.564 |
| 90.16853932584269 | -14.086 | 16.331 | 201.269 | 202.462 |
| 90.33532303370787 | -13.714 | 16.658 | 197.822 | 199.033 |
| 90.50210674157303 | -13.388 | 16.928 | 193.844 | 195.083 |
| 90.6688904494382 | -13.117 | 16.965 | 188.701 | 189.959 |
| 90.83567415730336 | -12.922 | 16.825 | 182.702 | 183.959 |
| 91.00245786516854 | -12.614 | 16.518 | 176.73 | 177.988 |
| 91.1692415730337 | -12.363 | 15.894 | 171.885 | 173.106 |
| 91.33602528089888 | -12.139 | 14.701 | 168.308 | 169.445 |
| 91.50280898876404 | -11.906 | 13.499 | 164.814 | 165.849 |
| 91.66959269662922 | -11.627 | 12.363 | 162.327 | 163.268 |
| 91.83637640449439 | -11.338 | 11.412 | 161.023 | 161.889 |
| 92.00316011235955 | -11.03 | 10.686 | 160.231 | 161.023 |
| 92.16994382022472 | -10.676 | 10.388 | 160.203 | 160.957 |
| 92.3367275280899 | -10.239 | 10.416 | 161.358 | 162.075 |
| 92.50351123595506 | -9.736 | 10.546 | 162.7 | 163.408 |
| 92.66151685393258 | -9.354 | 10.965 | 162.728 | 163.464 |
| 92.82830056179776 | -8.962 | 11.375 | 162.411 | 163.165 |
| 92.99508426966291 | -8.618 | 11.58 | 161.87 | 162.616 |
| 93.16186797752809 | -8.366 | 11.776 | 160.706 | 161.461 |
| 93.32865168539325 | -8.208 | 11.897 | 158.712 | 159.476 |
| 93.49543539325842 | -8.04 | 11.571 | 155.973 | 156.719 |
| 93.66221910112358 | -7.947 | 11.226 | 152.871 | 153.598 |
| 93.82900280898876 | -7.872 | 10.574 | 150.579 | 151.259 |
| 93.99578651685393 | -7.686 | 9.931 | 149.61 | 150.262 |
| 94.1625702247191 | -7.472 | 9.493 | 149.359 | 149.974 |
| 94.32935393258427 | -7.304 | 9.065 | 149.638 | 150.216 |
| 94.49613764044945 | -7.146 | 8.72 | 150.849 | 151.39 |
| 94.66292134831461 | -6.885 | 8.441 | 152.554 | 153.048 |
| 94.82970505617978 | -6.54 | 8.711 | 154.762 | 155.265 |
| 94.99648876404494 | -6.195 | 9.186 | 156.793 | 157.324 |
| 95.16327247191012 | -5.804 | 9.4 | 157.911 | 158.442 |
| 95.33005617977528 | -5.636 | 9.633 | 158.004 | 158.545 |
| 95.49683988764046 | -5.506 | 9.633 | 157.883 | 158.423 |
| 95.66362359550563 | -5.608 | 9.456 | 156.756 | 157.287 |
| 95.83040730337078 | -5.795 | 8.906 | 155.312 | 155.815 |
| 95.99719101123594 | -5.934 | 8.254 | 154.958 | 155.424 |
| 96.16397471910112 | -6.056 | 7.5 | 156.141 | 156.56 |
| 96.33075842696628 | -6.214 | 6.801 | 157.892 | 158.274 |
| 96.49754213483145 | -6.316 | 6.605 | 160.529 | 160.892 |
| 96.66432584269663 | -6.382 | 6.717 | 164.032 | 164.386 |
| 96.8311095505618 | -6.382 | 6.708 | 167.022 | 167.376 |
| 96.99789325842697 | -6.344 | 6.717 | 169.249 | 169.594 |
| 97.16467696629213 | -6.177 | 6.736 | 170.907 | 171.243 |
| 97.3314606741573 | -5.934 | 6.624 | 171.699 | 172.025 |
| 97.49824438202248 | -5.776 | 6.698 | 172.612 | 172.92 |
| 97.66502808988764 | -5.608 | 6.81 | 173.441 | 173.749 |
| 97.8318117977528 | -5.413 | 6.997 | 174.084 | 174.401 |
| 97.99859550561798 | -5.245 | 7.304 | 173.926 | 174.252 |
| 98.16537921348316 | -5.077 | 7.295 | 173.208 | 173.525 |
| 98.33216292134833 | -4.835 | 7.798 | 172.37 | 172.715 |
| 98.49894662921349 | -4.621 | 8.254 | 171.019 | 171.382 |
| 98.66573033707866 | -4.472 | 8.338 | 169.668 | 170.041 |
| 98.8325140449438 | -4.341 | 8.254 | 169.631 | 170.004 |
| 98.99929775280897 | -4.146 | 8.236 | 170.05 | 170.432 |
| 99.16608146067416 | -3.792 | 8.711 | 171.513 | 171.941 |
| 99.33286516853933 | -3.484 | 9.111 | 173.218 | 173.674 |
| 99.49964887640449 | -3.214 | 9.633 | 173.59 | 174.084 |
| 99.66643258426966 | -3.009 | 10.332 | 172.566 | 173.097 |
| 99.83321629213484 | -2.869 | 10.881 | 171.513 | 172.072 |
| 100.0 | -2.59 | 11.534 | 171.075 | 171.708 |